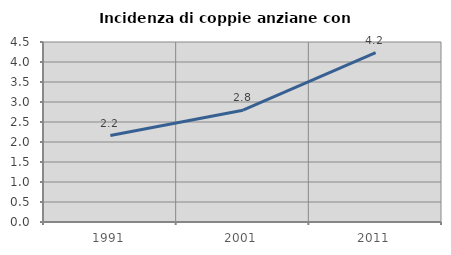
| Category | Incidenza di coppie anziane con figli |
|---|---|
| 1991.0 | 2.161 |
| 2001.0 | 2.794 |
| 2011.0 | 4.235 |